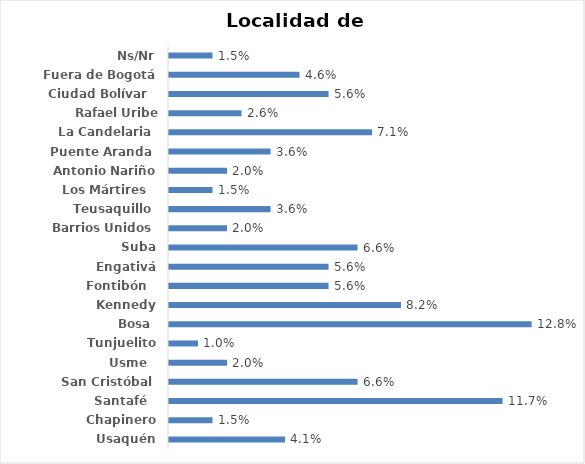
| Category | Series 0 |
|---|---|
| Usaquén | 0.041 |
| Chapinero | 0.015 |
| Santafé   | 0.117 |
| San Cristóbal  | 0.066 |
| Usme   | 0.02 |
| Tunjuelito | 0.01 |
| Bosa  | 0.128 |
| Kennedy | 0.082 |
| Fontibón   | 0.056 |
| Engativá | 0.056 |
| Suba | 0.066 |
| Barrios Unidos  | 0.02 |
| Teusaquillo  | 0.036 |
| Los Mártires   | 0.015 |
| Antonio Nariño | 0.02 |
| Puente Aranda  | 0.036 |
| La Candelaria  | 0.071 |
| Rafael Uribe Uribe  | 0.026 |
| Ciudad Bolívar   | 0.056 |
| Fuera de Bogotá | 0.046 |
| Ns/Nr | 0.015 |